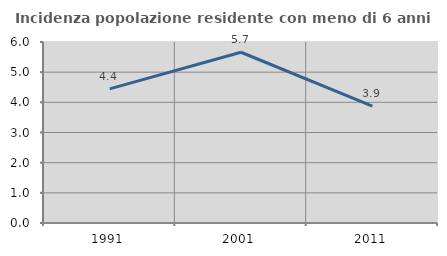
| Category | Incidenza popolazione residente con meno di 6 anni |
|---|---|
| 1991.0 | 4.444 |
| 2001.0 | 5.66 |
| 2011.0 | 3.876 |